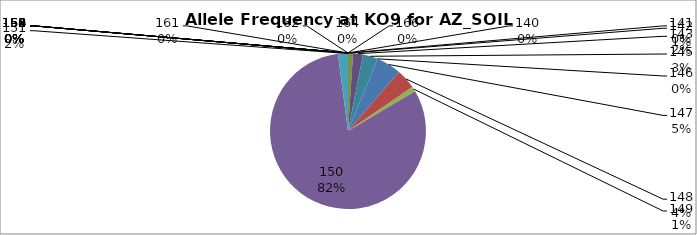
| Category | Series 0 |
|---|---|
| 140.0 | 0 |
| 141.0 | 0 |
| 142.0 | 0.01 |
| 143.0 | 0.021 |
| 145.0 | 0.031 |
| 146.0 | 0 |
| 147.0 | 0.052 |
| 148.0 | 0.041 |
| 149.0 | 0.01 |
| 150.0 | 0.814 |
| 151.0 | 0.021 |
| 152.0 | 0 |
| 153.0 | 0 |
| 154.0 | 0 |
| 155.0 | 0 |
| 156.0 | 0 |
| 158.0 | 0 |
| 160.0 | 0 |
| 161.0 | 0 |
| 162.0 | 0 |
| 164.0 | 0 |
| 166.0 | 0 |